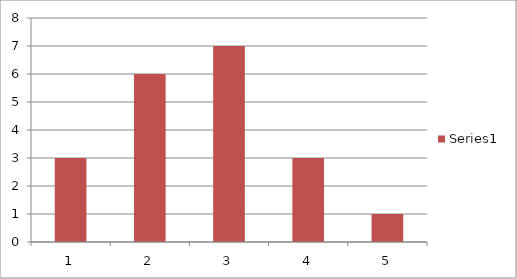
| Category | Series 1 |
|---|---|
| 0 | 3 |
| 1 | 6 |
| 2 | 7 |
| 3 | 3 |
| 4 | 1 |